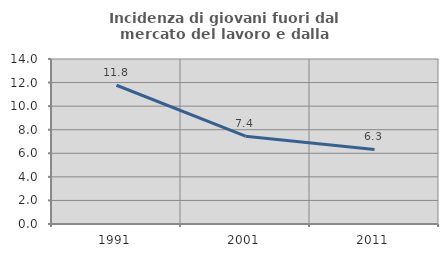
| Category | Incidenza di giovani fuori dal mercato del lavoro e dalla formazione  |
|---|---|
| 1991.0 | 11.772 |
| 2001.0 | 7.449 |
| 2011.0 | 6.329 |